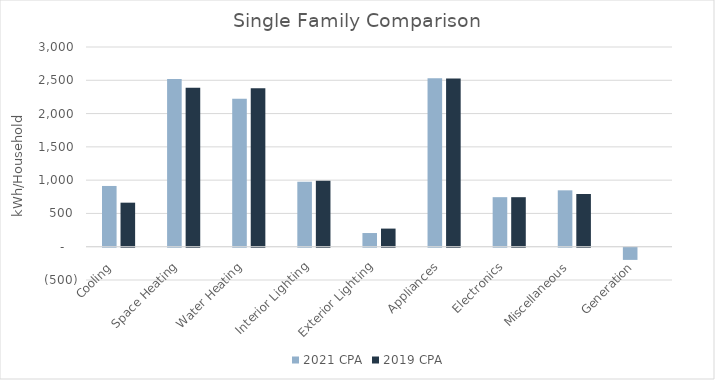
| Category | 2021 CPA | 2019 CPA |
|---|---|---|
|  Cooling  | 912.499 | 661.496 |
|  Space Heating  | 2518.624 | 2386.669 |
|  Water Heating  | 2223.464 | 2381.798 |
|  Interior Lighting  | 974.633 | 989.046 |
|  Exterior Lighting  | 205.575 | 272.192 |
|  Appliances  | 2530.397 | 2525.72 |
|  Electronics  | 744.16 | 743.924 |
|  Miscellaneous  | 846.96 | 792.267 |
|  Generation  | -183.088 | 0 |